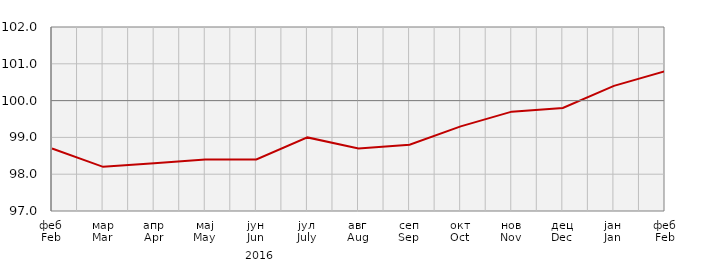
| Category | Индекси потрошачких цијена
Consumer price indices |
|---|---|
| феб
Feb | 98.7 |
| мар
Mar | 98.2 |
| апр
Apr | 98.3 |
| мај
May | 98.4 |
| јун
Jun | 98.4 |
| јул
July | 99 |
| авг
Aug | 98.7 |
| сеп
Sep | 98.8 |
| окт
Oct | 99.3 |
| нов
Nov | 99.7 |
| дец
Dec | 99.8 |
| јан
Jan | 100.4 |
| феб
Feb | 100.8 |